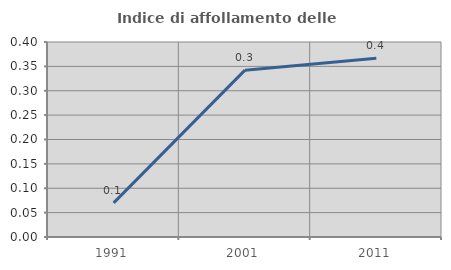
| Category | Indice di affollamento delle abitazioni  |
|---|---|
| 1991.0 | 0.07 |
| 2001.0 | 0.342 |
| 2011.0 | 0.367 |